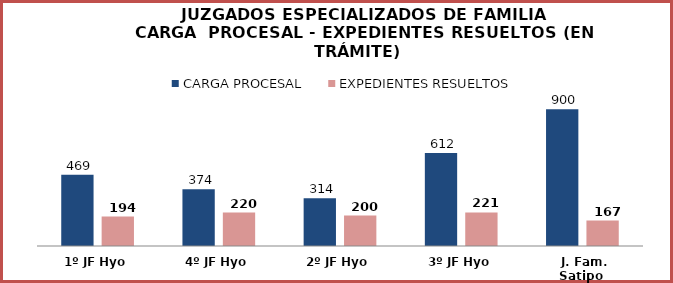
| Category | CARGA PROCESAL | EXPEDIENTES RESUELTOS |
|---|---|---|
| 1º JF Hyo | 469 | 194 |
| 4º JF Hyo | 374 | 220 |
| 2º JF Hyo | 314 | 200 |
| 3º JF Hyo | 612 | 221 |
| J. Fam. Satipo | 900 | 167 |